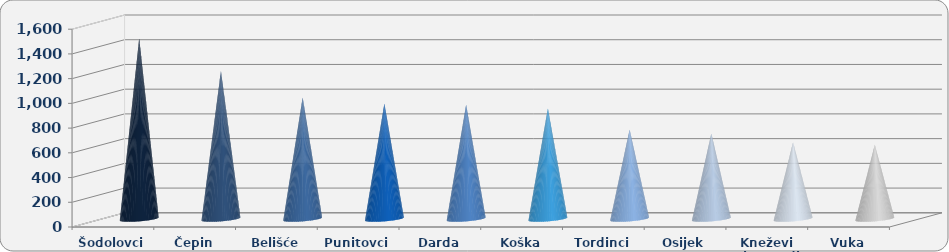
| Category | Produktivnost |
|---|---|
| Šodolovci | 1461.492 |
| Čepin | 1196.306 |
| Belišće | 982.466 |
| Punitovci | 933.627 |
| Darda | 924.43 |
| Koška | 895.697 |
| Tordinci | 724.208 |
| Osijek | 690.642 |
| Kneževi Vinogradi | 620.435 |
| Vuka | 601.58 |